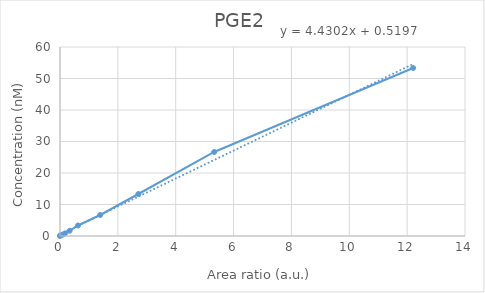
| Category | PGE2 |
|---|---|
| 0.0 | 0 |
| 0.00866243640952118 | 0.208 |
| 0.0849050484559444 | 0.417 |
| 0.172480266795816 | 0.833 |
| 0.33299747708456 | 1.667 |
| 0.622931487452693 | 3.333 |
| 1.38894964390857 | 6.667 |
| 2.70791632724525 | 13.333 |
| 5.32993083657005 | 26.667 |
| 12.2079582931406 | 53.333 |